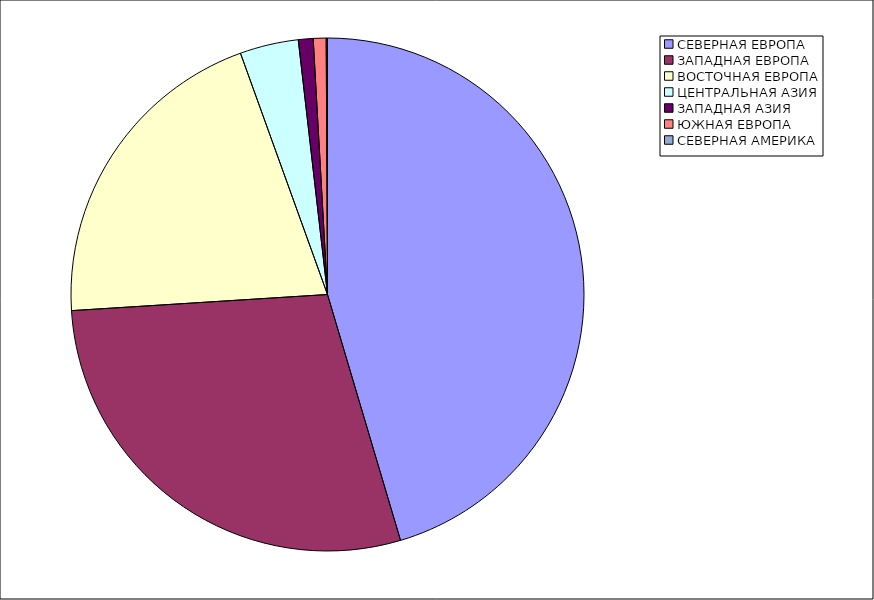
| Category | Оборот |
|---|---|
| СЕВЕРНАЯ ЕВРОПА | 45.4 |
| ЗАПАДНАЯ ЕВРОПА | 28.59 |
| ВОСТОЧНАЯ ЕВРОПА | 20.49 |
| ЦЕНТРАЛЬНАЯ АЗИЯ | 3.69 |
| ЗАПАДНАЯ АЗИЯ | 0.93 |
| ЮЖНАЯ ЕВРОПА | 0.81 |
| СЕВЕРНАЯ АМЕРИКА | 0.08 |